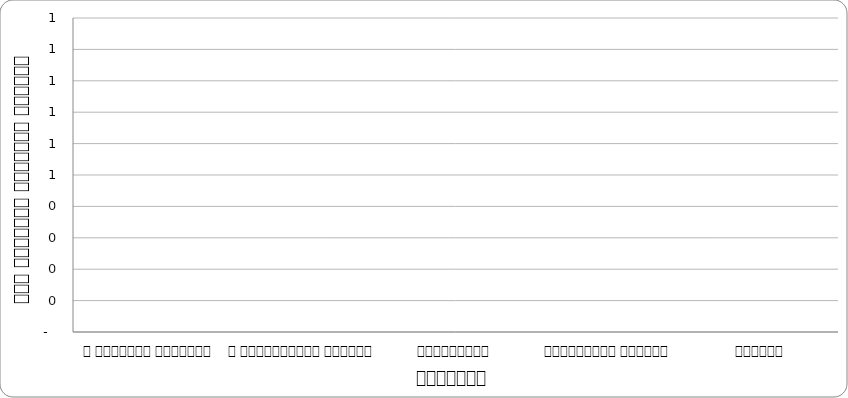
| Category | वातावरण |
|---|---|
| द हिमालयन टाइम्स् | 0 |
| द काठमाण्डौं पोस्ट् | 0 |
| कान्तिपुर | 0 |
| अन्नपूर्ण पोस्ट् | 0 |
| नागरिक | 0 |